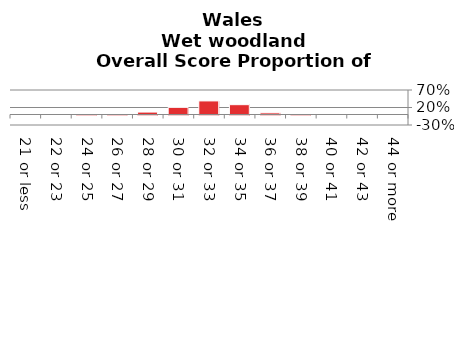
| Category | Wet woodland |
|---|---|
| 21 or less | 0 |
| 22 or 23 | 0 |
| 24 or 25 | 0 |
| 26 or 27 | 0.006 |
| 28 or 29 | 0.069 |
| 30 or 31 | 0.204 |
| 32 or 33 | 0.388 |
| 34 or 35 | 0.28 |
| 36 or 37 | 0.047 |
| 38 or 39 | 0.005 |
| 40 or 41 | 0 |
| 42 or 43 | 0 |
| 44 or more | 0 |